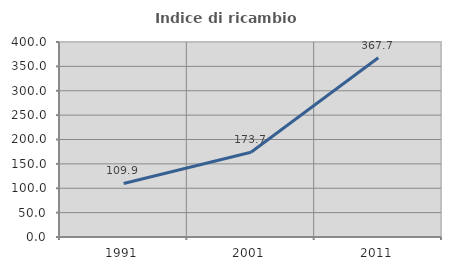
| Category | Indice di ricambio occupazionale  |
|---|---|
| 1991.0 | 109.859 |
| 2001.0 | 173.684 |
| 2011.0 | 367.692 |